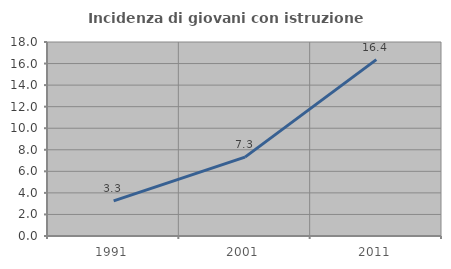
| Category | Incidenza di giovani con istruzione universitaria |
|---|---|
| 1991.0 | 3.261 |
| 2001.0 | 7.317 |
| 2011.0 | 16.364 |